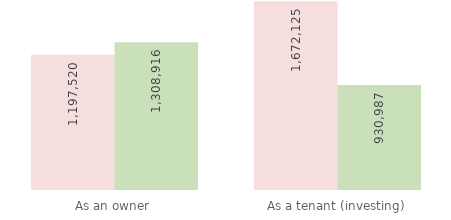
| Category | Housing cost | Take home |
|---|---|---|
| 0 | 1197519.89 | 1308916.323 |
| 1 | 1672125 | 930987.362 |